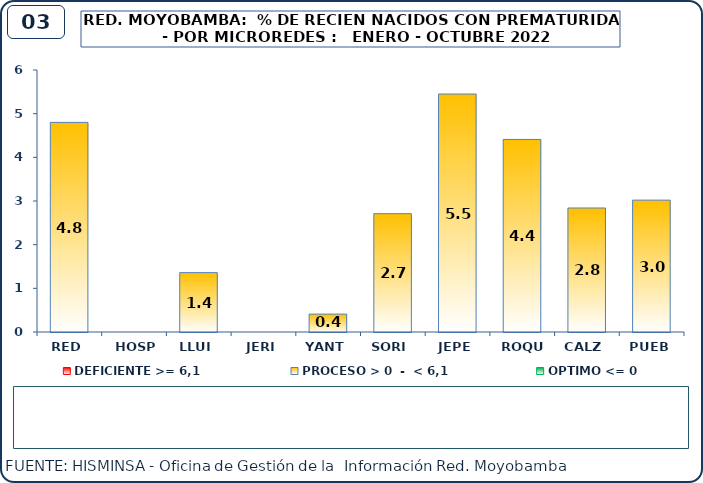
| Category | DEFICIENTE >= 6,1 | PROCESO > 0  -  < 6,1 | OPTIMO <= 0 |
|---|---|---|---|
| RED | 0 | 4.8 | 0 |
| HOSP | 0 | 0 | 0 |
| LLUI | 0 | 1.36 | 0 |
| JERI | 0 | 0 | 0 |
| YANT | 0 | 0.41 | 0 |
| SORI | 0 | 2.71 | 0 |
| JEPE | 0 | 5.45 | 0 |
| ROQU | 0 | 4.41 | 0 |
| CALZ | 0 | 2.84 | 0 |
| PUEB | 0 | 3.02 | 0 |